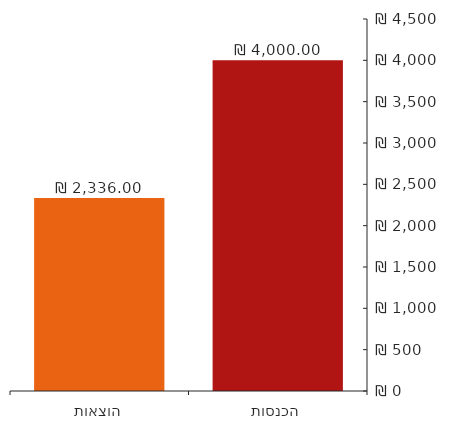
| Category | נתוני_תרשים |
|---|---|
| 0 | 4000 |
| 1 | 2336 |